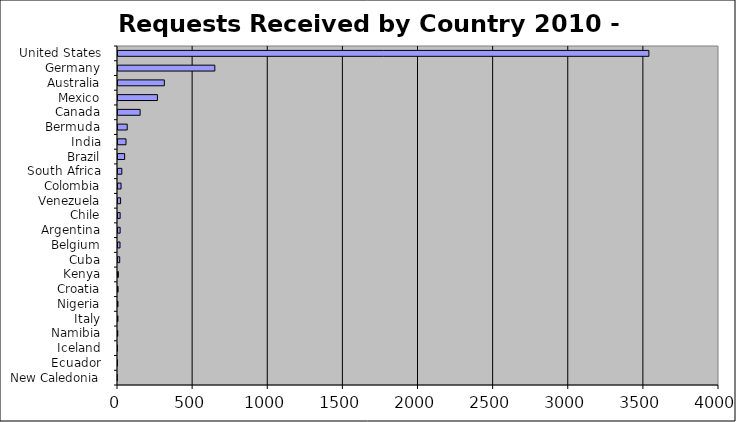
| Category | Series 0 |
|---|---|
| New Caledonia  | 1 |
| Ecuador  | 3 |
| Iceland  | 3 |
| Namibia  | 5 |
| Italy  | 6 |
| Nigeria  | 6 |
| Croatia  | 7 |
| Kenya  | 9 |
| Cuba  | 18 |
| Belgium  | 20 |
| Argentina  | 21 |
| Chile  | 21 |
| Venezuela  | 24 |
| Colombia  | 27 |
| South Africa  | 32 |
| Brazil  | 51 |
| India  | 60 |
| Bermuda  | 68 |
| Canada  | 154 |
| Mexico  | 269 |
| Australia  | 315 |
| Germany  | 651 |
| United States  | 3540 |